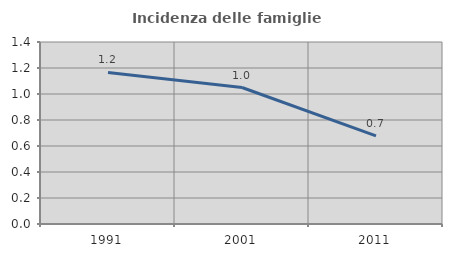
| Category | Incidenza delle famiglie numerose |
|---|---|
| 1991.0 | 1.166 |
| 2001.0 | 1.05 |
| 2011.0 | 0.677 |